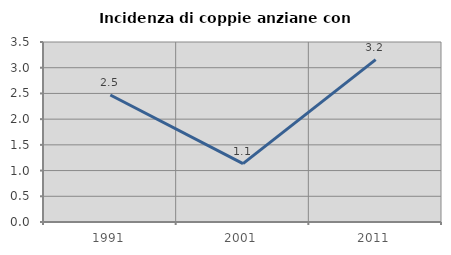
| Category | Incidenza di coppie anziane con figli |
|---|---|
| 1991.0 | 2.469 |
| 2001.0 | 1.136 |
| 2011.0 | 3.158 |